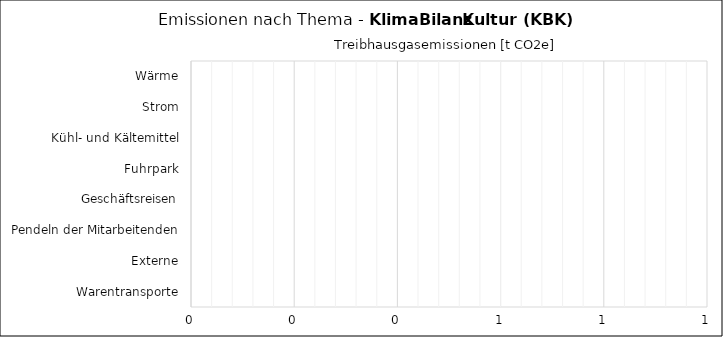
| Category | Series 0 |
|---|---|
| Wärme | 0 |
| Strom | 0 |
| Kühl- und Kältemittel | 0 |
| Fuhrpark | 0 |
| Geschäftsreisen | 0 |
| Pendeln der Mitarbeitenden | 0 |
| Externe | 0 |
| Warentransporte | 0 |